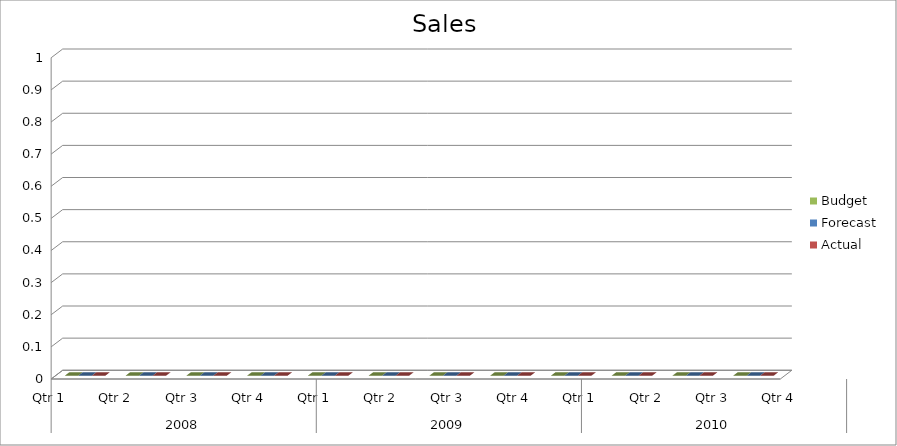
| Category | Budget | Forecast | Actual |
|---|---|---|---|
| 0 | 1390 | 820 | 1910 |
| 1 | 2140 | 2680 | 2970 |
| 2 | 1980 | 1050 | 3270 |
| 3 | 3070 | 1670 | 2230 |
| 4 | 630 | 930 | 1560 |
| 5 | 3240 | 1730 | 2060 |
| 6 | 2460 | 660 | 3010 |
| 7 | 790 | 770 | 3350 |
| 8 | 2200 | 780 | 750 |
| 9 | 1200 | 2570 | 3410 |
| 10 | 3460 | 1150 | 2170 |
| 11 | 1330 | 1160 | 1420 |